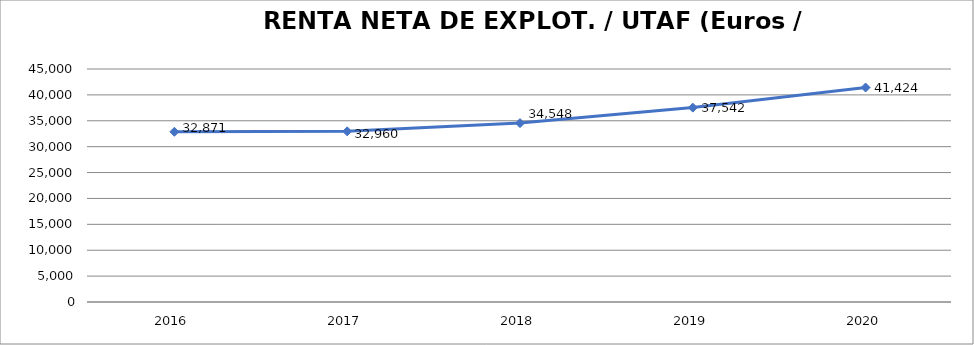
| Category | 2016 |
|---|---|
| 2016.0 | 32871.157 |
| 2017.0 | 32959.749 |
| 2018.0 | 34547.878 |
| 2019.0 | 37542.222 |
| 2020.0 | 41423.911 |